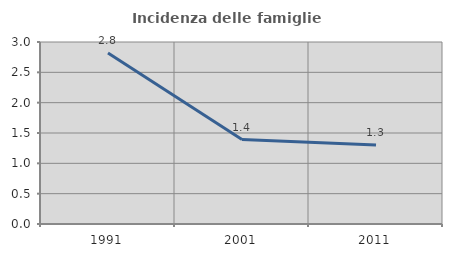
| Category | Incidenza delle famiglie numerose |
|---|---|
| 1991.0 | 2.818 |
| 2001.0 | 1.391 |
| 2011.0 | 1.304 |